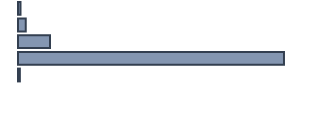
| Category | 0,8 2,5 10,3 85,8 0,6 0,0 |
|---|---|
| 0 | 0.8 |
| 1 | 2.5 |
| 2 | 10.3 |
| 3 | 85.8 |
| 4 | 0.6 |
| 5 | 0 |